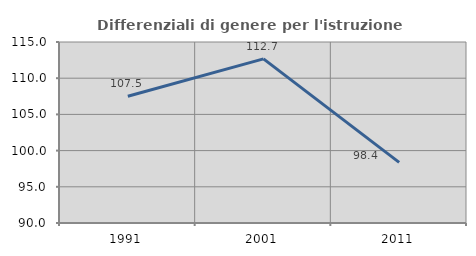
| Category | Differenziali di genere per l'istruzione superiore |
|---|---|
| 1991.0 | 107.513 |
| 2001.0 | 112.674 |
| 2011.0 | 98.369 |